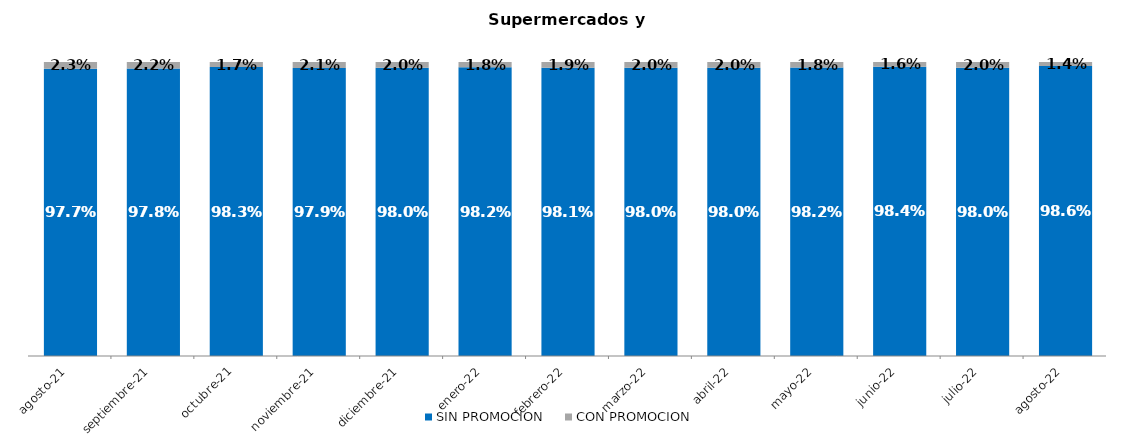
| Category | SIN PROMOCION   | CON PROMOCION   |
|---|---|---|
| 2021-08-01 | 0.977 | 0.023 |
| 2021-09-01 | 0.978 | 0.022 |
| 2021-10-01 | 0.983 | 0.017 |
| 2021-11-01 | 0.979 | 0.021 |
| 2021-12-01 | 0.98 | 0.02 |
| 2022-01-01 | 0.982 | 0.018 |
| 2022-02-01 | 0.981 | 0.019 |
| 2022-03-01 | 0.98 | 0.02 |
| 2022-04-01 | 0.98 | 0.02 |
| 2022-05-01 | 0.982 | 0.018 |
| 2022-06-01 | 0.984 | 0.016 |
| 2022-07-01 | 0.98 | 0.02 |
| 2022-08-01 | 0.986 | 0.014 |